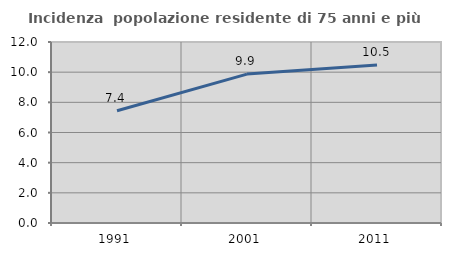
| Category | Incidenza  popolazione residente di 75 anni e più |
|---|---|
| 1991.0 | 7.44 |
| 2001.0 | 9.874 |
| 2011.0 | 10.469 |